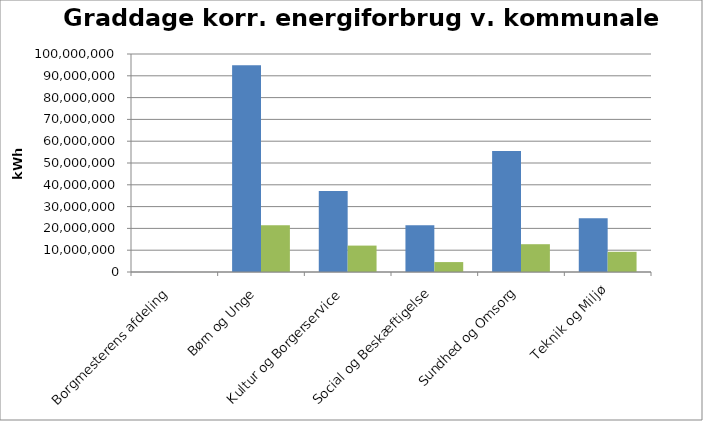
| Category | 2009 | 2010 |
|---|---|---|
| Borgmesterens afdeling | 24390 | 0 |
| Børn og Unge | 94853943 | 21474704 |
| Kultur og Borgerservice | 37167421 | 12114216 |
| Social og Beskæftigelse | 21446993 | 4548262 |
| Sundhed og Omsorg | 55548219 | 12749826 |
| Teknik og Miljø | 24682759 | 9265458 |